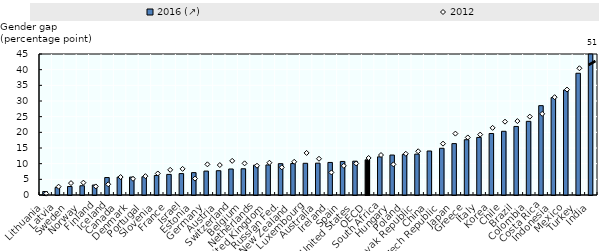
| Category | 2016 (↗) |
|---|---|
| Lithuania | 1.116 |
| Latvia | 2.381 |
| Sweden | 2.714 |
| Norway | 2.954 |
| Finland | 3.186 |
| Iceland | 5.575 |
| Canada | 5.708 |
| Denmark | 5.71 |
| Portugal | 5.821 |
| Slovenia | 6.232 |
| France | 6.573 |
| Israel | 6.835 |
| Estonia | 7.141 |
| Germany | 7.634 |
| Austria | 7.753 |
| Switzerland | 8.299 |
| Belgium | 8.369 |
| Netherlands | 9.524 |
| United Kingdom | 9.59 |
| Russian Fed. | 10.002 |
| New Zealand | 10.044 |
| Luxembourg | 10.123 |
| Australia | 10.164 |
| Ireland | 10.391 |
| Spain | 10.707 |
| United States | 10.786 |
| OECD | 11.217 |
| South Africa | 12.176 |
| Hungary | 12.754 |
| Poland | 12.931 |
| Slovak Republic | 13.046 |
| China | 14.038 |
| Czech Republic | 14.911 |
| Japan | 16.402 |
| Greece | 17.64 |
| Italy | 18.377 |
| Korea | 19.632 |
| Chile | 20.335 |
| Brazil | 21.881 |
| Colombia | 23.512 |
| Costa Rica | 28.514 |
| Indonesia | 31.078 |
| Mexico | 33.508 |
| Turkey | 38.854 |
| India | 51.206 |